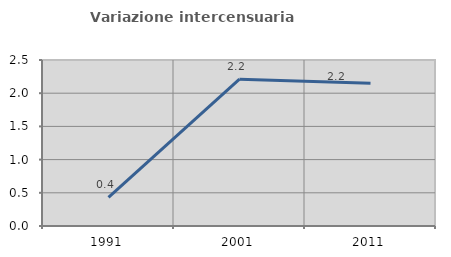
| Category | Variazione intercensuaria annua |
|---|---|
| 1991.0 | 0.432 |
| 2001.0 | 2.212 |
| 2011.0 | 2.151 |